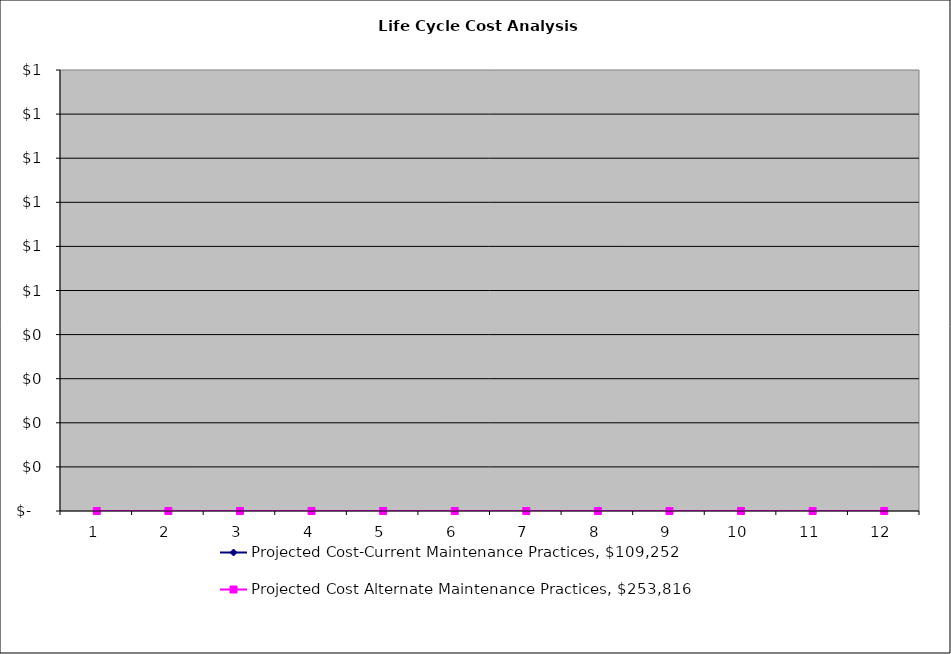
| Category | Projected Cost-Current Maintenance Practices, $109,252   | Projected Cost Alternate Maintenance Practices, $253,816 |
|---|---|---|
| 1.0 | 0 | 0 |
| 2.0 | 0 | 0 |
| 3.0 | 0 | 0 |
| 4.0 | 0 | 0 |
| 5.0 | 0 | 0 |
| 6.0 | 0 | 0 |
| 7.0 | 0 | 0 |
| 8.0 | 0 | 0 |
| 9.0 | 0 | 0 |
| 10.0 | 0 | 0 |
| 11.0 | 0 | 0 |
| 12.0 | 0 | 0 |